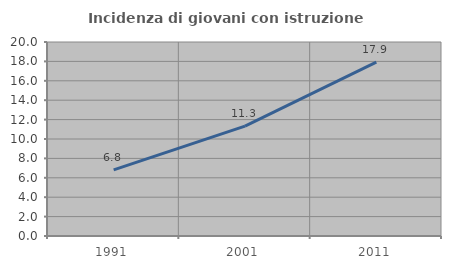
| Category | Incidenza di giovani con istruzione universitaria |
|---|---|
| 1991.0 | 6.818 |
| 2001.0 | 11.33 |
| 2011.0 | 17.925 |